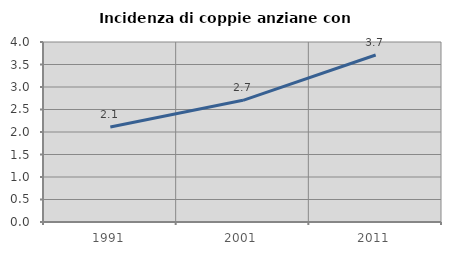
| Category | Incidenza di coppie anziane con figli |
|---|---|
| 1991.0 | 2.11 |
| 2001.0 | 2.704 |
| 2011.0 | 3.71 |